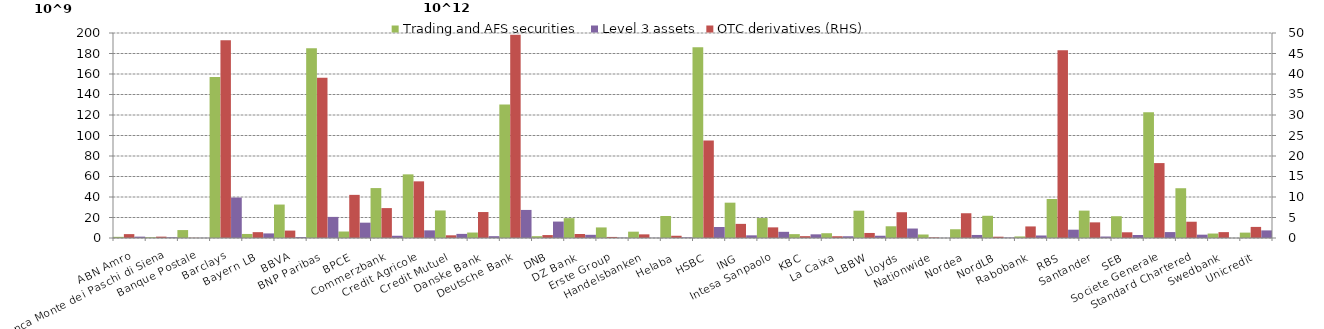
| Category | Trading and AFS securities | Level 3 assets |
|---|---|---|
| ABN Amro | 1125 | 1321 |
| Banca Monte dei Paschi di Siena | 690.118 | 690.606 |
| Banque Postale | 7736.026 | 126.632 |
| Barclays | 157026.508 | 39479.758 |
| Bayern LB | 3941.387 | 4478 |
| BBVA | 32632.698 | 887.39 |
| BNP Paribas | 185202.858 | 20589.659 |
| BPCE | 6329 | 14959 |
| Commerzbank | 48706 | 2182 |
| Credit Agricole | 62091 | 7462 |
| Credit Mutuel | 26867.195 | 4018.577 |
| Danske Bank | 5332.538 | 1775.77 |
| Deutsche Bank | 130131.502 | 27383.939 |
| DNB | 1766.868 | 16024.056 |
| DZ Bank | 19369.707 | 3120 |
| Erste Group | 10311.245 | 331 |
| Handelsbanken | 6172.544 | 146.772 |
| Helaba | 21445.895 | 574.694 |
| HSBC | 186014.792 | 10712.84 |
| ING | 34469 | 2601 |
| Intesa Sanpaolo | 19469.663 | 6026 |
| KBC | 3771 | 3582 |
| La Caixa | 4654.74 | 1697.706 |
| LBBW | 26640.922 | 2204.188 |
| Lloyds | 11441.766 | 9235.936 |
| Nationwide | 3418.496 | 98.357 |
| Nordea | 8533 | 2966 |
| NordLB | 21668.656 | 414.894 |
| Rabobank | 1521 | 2438 |
| RBS | 38064.052 | 8109.632 |
| Santander | 26710.493 | 1431.381 |
| SEB | 21240.345 | 2907.18 |
| Societe Generale | 122708.931 | 5780.608 |
| Standard Chartered | 48551.229 | 3236.894 |
| Swedbank | 4362.098 | 21.447 |
| Unicredit | 5254.705 | 7412 |